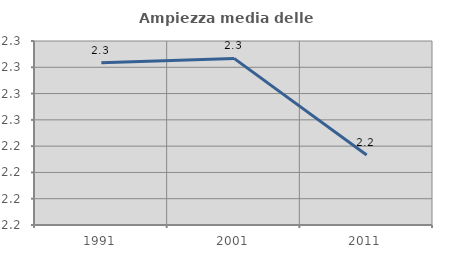
| Category | Ampiezza media delle famiglie |
|---|---|
| 1991.0 | 2.303 |
| 2001.0 | 2.307 |
| 2011.0 | 2.233 |